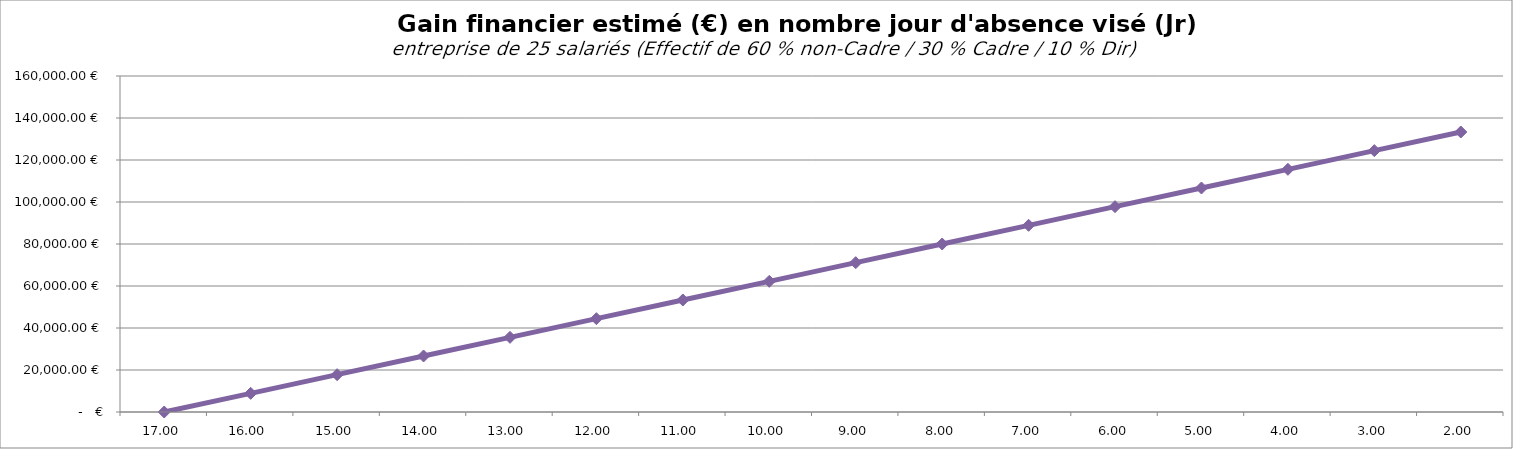
| Category | Series 0 |
|---|---|
| 17.0 | 0 |
| 16.0 | 8889.382 |
| 15.0 | 17778.764 |
| 14.0 | 26668.145 |
| 13.0 | 35557.527 |
| 12.0 | 44446.909 |
| 11.0 | 53336.291 |
| 10.0 | 62225.673 |
| 9.0 | 71115.055 |
| 8.0 | 80004.436 |
| 7.0 | 88893.818 |
| 6.0 | 97783.2 |
| 5.0 | 106672.582 |
| 4.0 | 115561.964 |
| 3.0 | 124451.345 |
| 2.0 | 133340.727 |